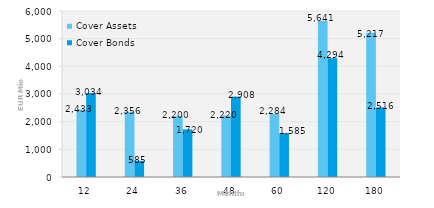
| Category | Cover Assets | Cover Bonds |
|---|---|---|
| 12.0 | 2433.4 | 3033.7 |
| 24.0 | 2356 | 584.5 |
| 36.0 | 2200.2 | 1720.4 |
| 48.0 | 2219.6 | 2907.5 |
| 60.0 | 2284 | 1584.5 |
| 120.0 | 5640.6 | 4294.4 |
| 180.0 | 5217.1 | 2516.1 |